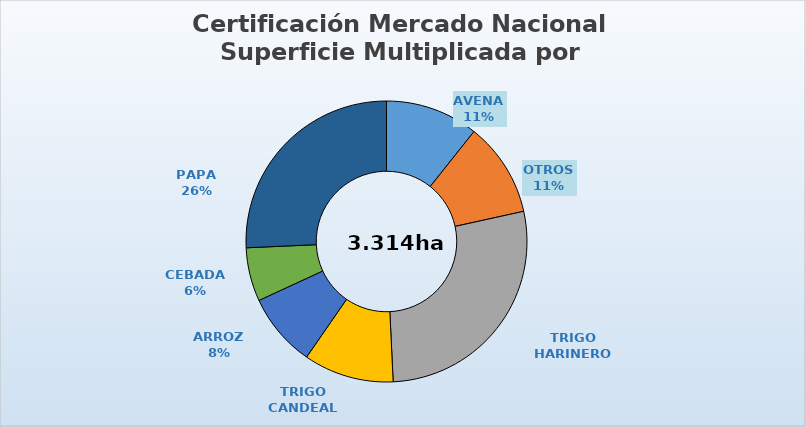
| Category | Series 0 |
|---|---|
| AVENA | 354.5 |
| OTROS | 359.8 |
| TRIGO HARINERO | 917.8 |
| TRIGO CANDEAL | 344.1 |
| ARROZ | 281.254 |
| CEBADA | 204.5 |
| PAPA | 852.3 |